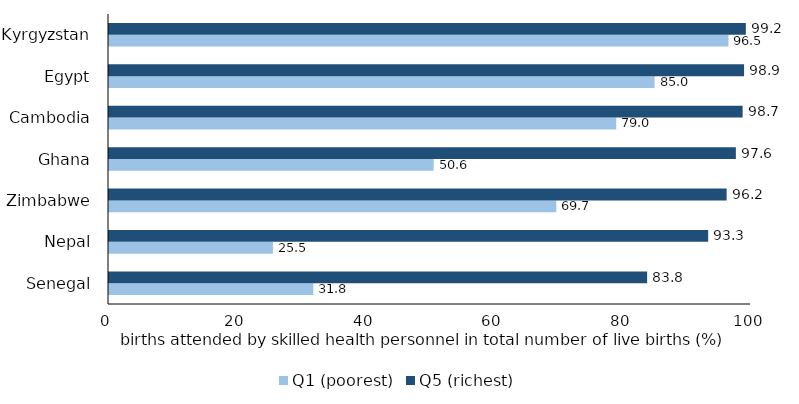
| Category | Q1 (poorest) | Q5 (richest) |
|---|---|---|
| Senegal | 31.826 | 83.821 |
| Nepal | 25.537 | 93.327 |
| Zimbabwe | 69.669 | 96.205 |
| Ghana | 50.571 | 97.641 |
| Cambodia | 79.005 | 98.698 |
| Egypt | 84.984 | 98.92 |
| Kyrgyzstan | 96.488 | 99.195 |